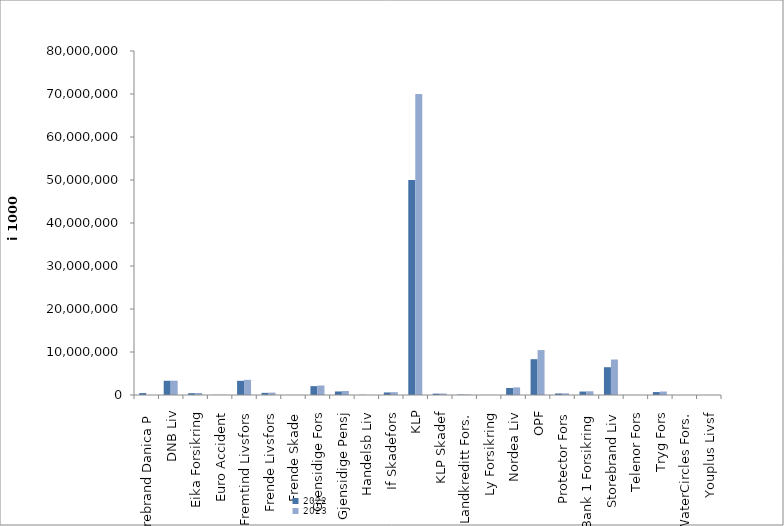
| Category | 2022 | 2023 |
|---|---|---|
| Storebrand Danica P | 446524.267 | 0 |
| DNB Liv | 3309302.725 | 3324348 |
| Eika Forsikring | 422091 | 458948 |
| Euro Accident | 32885 | 45333 |
| Fremtind Livsfors | 3294986.774 | 3522711.451 |
| Frende Livsfors | 505151 | 555601 |
| Frende Skade | 9115.469 | 9340.876 |
| Gjensidige Fors | 2060959.478 | 2207185.087 |
| Gjensidige Pensj | 822113 | 933569 |
| Handelsb Liv | 37620.57 | 0 |
| If Skadefors | 594471.875 | 655938.89 |
| KLP | 49973107.937 | 69993489.364 |
| KLP Skadef | 318629.59 | 343058.733 |
| Landkreditt Fors. | 101798 | 106120 |
| Ly Forsikring | 22009 | 27118 |
| Nordea Liv | 1622443.76 | 1776249.505 |
| OPF | 8323811 | 10450981 |
| Protector Fors | 356049.577 | 386585 |
| SpareBank 1 Forsikring | 803617.729 | 873185.769 |
| Storebrand Liv | 6462440.276 | 8256559.498 |
| Telenor Fors | 8426 | 8896 |
| Tryg Fors | 683873 | 809012.682 |
| WaterCircles Fors. | 2052 | 1704.429 |
| Youplus Livsf | 2177 | 24294 |